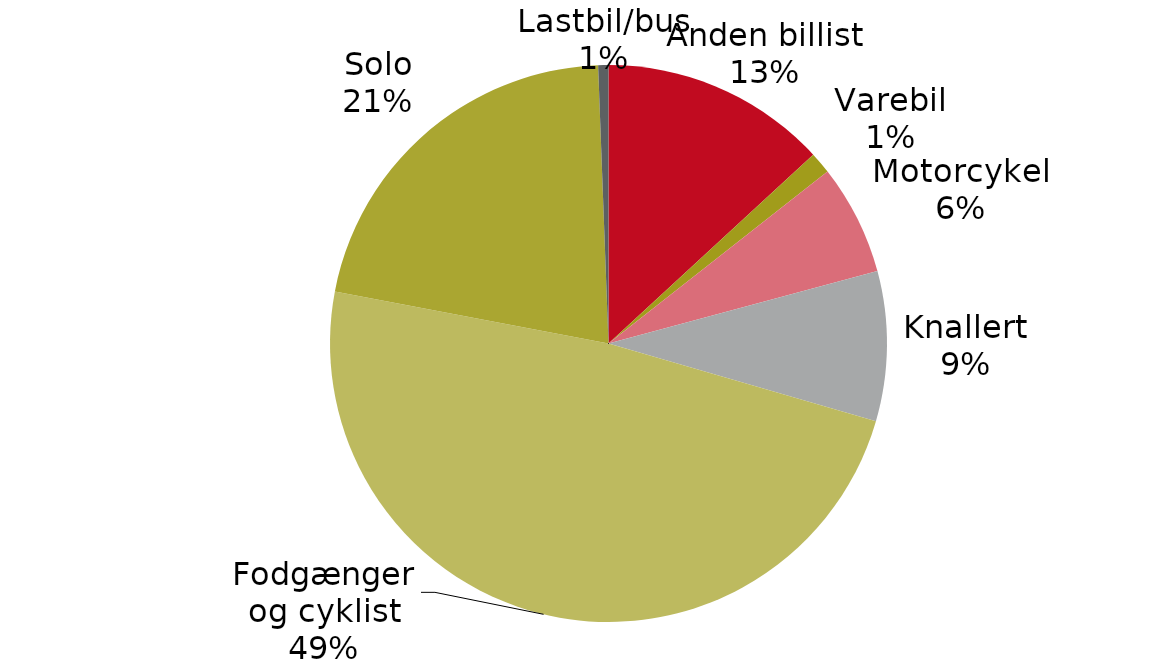
| Category | Series 0 |  Serie2 |
|---|---|---|
| Anden billist | 0.131 |  |
| Varebil | 0.013 |  |
| Motorcykel | 0.064 |  |
| Knallert | 0.087 |  |
| Fodgænger og cyklist | 0.485 |  |
| Solo | 0.214 |  |
| Lastbil/bus | 0.006 |  |